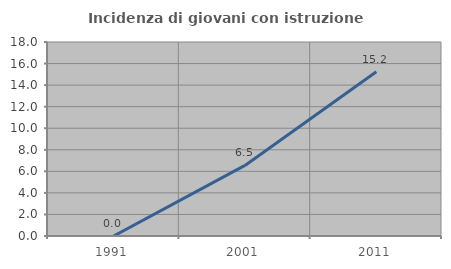
| Category | Incidenza di giovani con istruzione universitaria |
|---|---|
| 1991.0 | 0 |
| 2001.0 | 6.548 |
| 2011.0 | 15.244 |